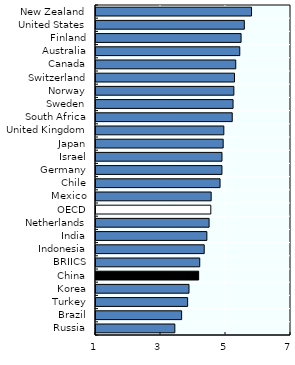
| Category | 2016-17 |
|---|---|
| Russia | 3.426 |
| Brazil | 3.635 |
| Turkey | 3.819 |
| Korea | 3.861 |
| China | 4.158 |
| BRIICS | 4.192 |
| Indonesia | 4.33 |
| India | 4.411 |
| Netherlands | 4.48 |
| OECD | 4.532 |
| Mexico | 4.544 |
| Chile | 4.817 |
| Germany | 4.875 |
| Israel | 4.876 |
| Japan | 4.913 |
| United Kingdom | 4.933 |
| South Africa | 5.192 |
| Sweden | 5.217 |
| Norway | 5.242 |
| Switzerland | 5.262 |
| Canada | 5.3 |
| Australia | 5.424 |
| Finland | 5.464 |
| United States | 5.564 |
| New Zealand | 5.786 |